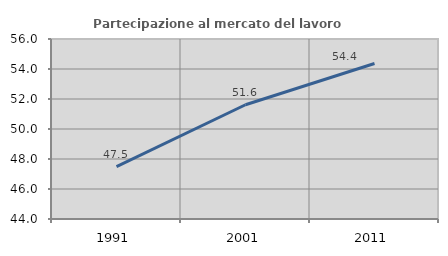
| Category | Partecipazione al mercato del lavoro  femminile |
|---|---|
| 1991.0 | 47.494 |
| 2001.0 | 51.616 |
| 2011.0 | 54.365 |